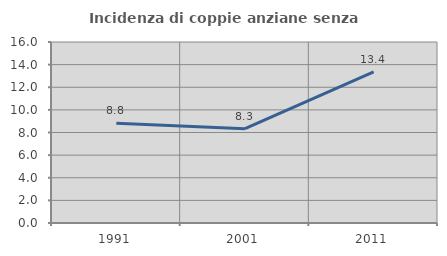
| Category | Incidenza di coppie anziane senza figli  |
|---|---|
| 1991.0 | 8.812 |
| 2001.0 | 8.333 |
| 2011.0 | 13.355 |